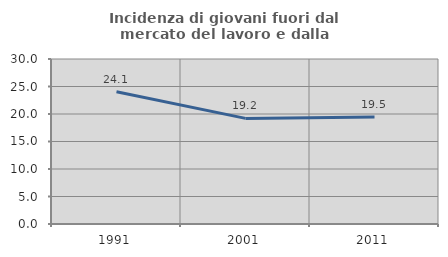
| Category | Incidenza di giovani fuori dal mercato del lavoro e dalla formazione  |
|---|---|
| 1991.0 | 24.054 |
| 2001.0 | 19.2 |
| 2011.0 | 19.469 |